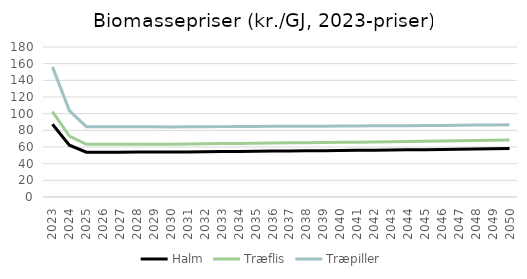
| Category | Halm | Træflis | Træpiller |
|---|---|---|---|
| 2023.0 | 87.28 | 102.38 | 156.11 |
| 2024.0 | 62.11 | 72.97 | 103.75 |
| 2025.0 | 53.78 | 63.24 | 84.43 |
| 2026.0 | 53.8 | 63.26 | 84.35 |
| 2027.0 | 53.82 | 63.29 | 84.28 |
| 2028.0 | 53.86 | 63.33 | 84.22 |
| 2029.0 | 53.9 | 63.37 | 84.17 |
| 2030.0 | 53.93 | 63.42 | 84.12 |
| 2031.0 | 54.11 | 63.63 | 84.21 |
| 2032.0 | 54.31 | 63.86 | 84.33 |
| 2033.0 | 54.5 | 64.09 | 84.45 |
| 2034.0 | 54.7 | 64.31 | 84.56 |
| 2035.0 | 54.89 | 64.53 | 84.66 |
| 2036.0 | 55.07 | 64.75 | 84.76 |
| 2037.0 | 55.26 | 64.97 | 84.85 |
| 2038.0 | 55.44 | 65.18 | 84.94 |
| 2039.0 | 55.62 | 65.38 | 85.02 |
| 2040.0 | 55.79 | 65.59 | 85.1 |
| 2041.0 | 56 | 65.83 | 85.23 |
| 2042.0 | 56.21 | 66.08 | 85.37 |
| 2043.0 | 56.43 | 66.33 | 85.5 |
| 2044.0 | 56.63 | 66.57 | 85.63 |
| 2045.0 | 56.84 | 66.81 | 85.75 |
| 2046.0 | 57.1 | 67.12 | 85.93 |
| 2047.0 | 57.36 | 67.42 | 86.1 |
| 2048.0 | 57.61 | 67.72 | 86.26 |
| 2049.0 | 57.86 | 68.01 | 86.42 |
| 2050.0 | 58.11 | 68.3 | 86.57 |